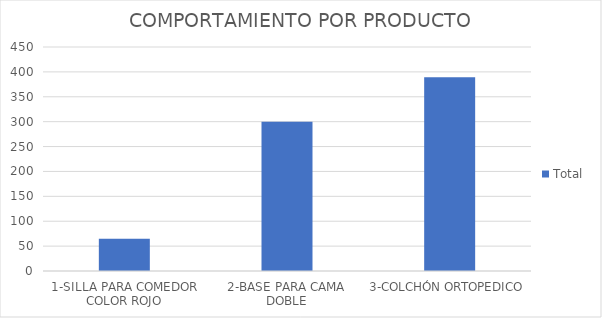
| Category | Total |
|---|---|
| 1-SILLA PARA COMEDOR COLOR ROJO | 65 |
| 2-BASE PARA CAMA DOBLE | 300 |
| 3-COLCHÓN ORTOPEDICO | 389 |